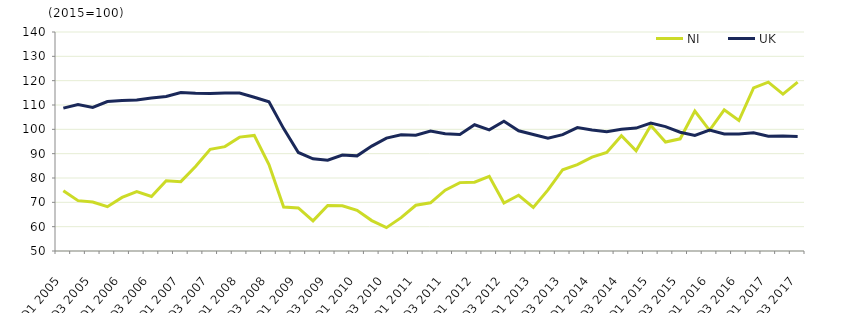
| Category | NI  | UK  |
|---|---|---|
| Q1 2005 | 74.8 | 108.7 |
|  | 70.7 | 110.2 |
| Q3 2005 | 70.1 | 109 |
|  | 68.2 | 111.4 |
| Q1 2006 | 72 | 111.8 |
|  | 74.4 | 112.1 |
| Q3 2006 | 72.4 | 112.9 |
|  | 78.9 | 113.5 |
| Q1 2007 | 78.5 | 115.1 |
|  | 84.7 | 114.8 |
| Q3 2007 | 91.8 | 114.7 |
|  | 92.9 | 114.9 |
| Q1 2008 | 96.8 | 114.9 |
|  | 97.5 | 113.2 |
| Q3 2008 | 85.5 | 111.3 |
|  | 68.1 | 100.3 |
| Q1 2009 | 67.7 | 90.5 |
|  | 62.4 | 87.9 |
| Q3 2009 | 68.7 | 87.3 |
|  | 68.6 | 89.4 |
| Q1 2010 | 66.7 | 89.1 |
|  | 62.5 | 93.1 |
| Q3 2010 | 59.6 | 96.4 |
|  | 63.7 | 97.8 |
| Q1 2011 | 68.8 | 97.6 |
|  | 69.8 | 99.3 |
| Q3 2011 | 75 | 98.2 |
|  | 78.1 | 97.9 |
| Q1 2012 | 78.3 | 101.9 |
|  | 80.7 | 99.8 |
| Q3 2012 | 69.7 | 103.3 |
|  | 72.9 | 99.4 |
| Q1 2013 | 67.9 | 97.9 |
|  | 75.1 | 96.4 |
| Q3 2013 | 83.4 | 97.8 |
|  | 85.5 | 100.7 |
| Q1 2014 | 88.6 | 99.7 |
|  | 90.5 | 99 |
| Q3 2014 | 97.4 | 100 |
|  | 91.2 | 100.5 |
| Q1 2015 | 101.6 | 102.6 |
|  | 94.8 | 101.1 |
| Q3 2015 | 96.1 | 98.8 |
|  | 107.5 | 97.5 |
| Q1 2016 | 99.6 | 99.7 |
|  | 108 | 98.1 |
| Q3 2016 | 103.6 | 98.1 |
|  | 117 | 98.6 |
| Q1 2017 | 119.4 | 97.2 |
|  | 114.5 | 97.3 |
| Q3 2017 | 119.4 | 97.1 |